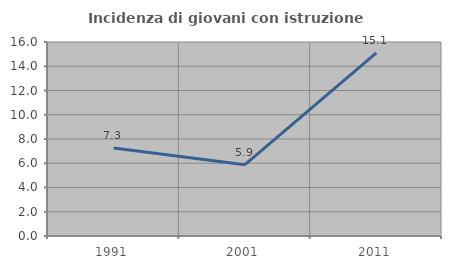
| Category | Incidenza di giovani con istruzione universitaria |
|---|---|
| 1991.0 | 7.263 |
| 2001.0 | 5.882 |
| 2011.0 | 15.094 |